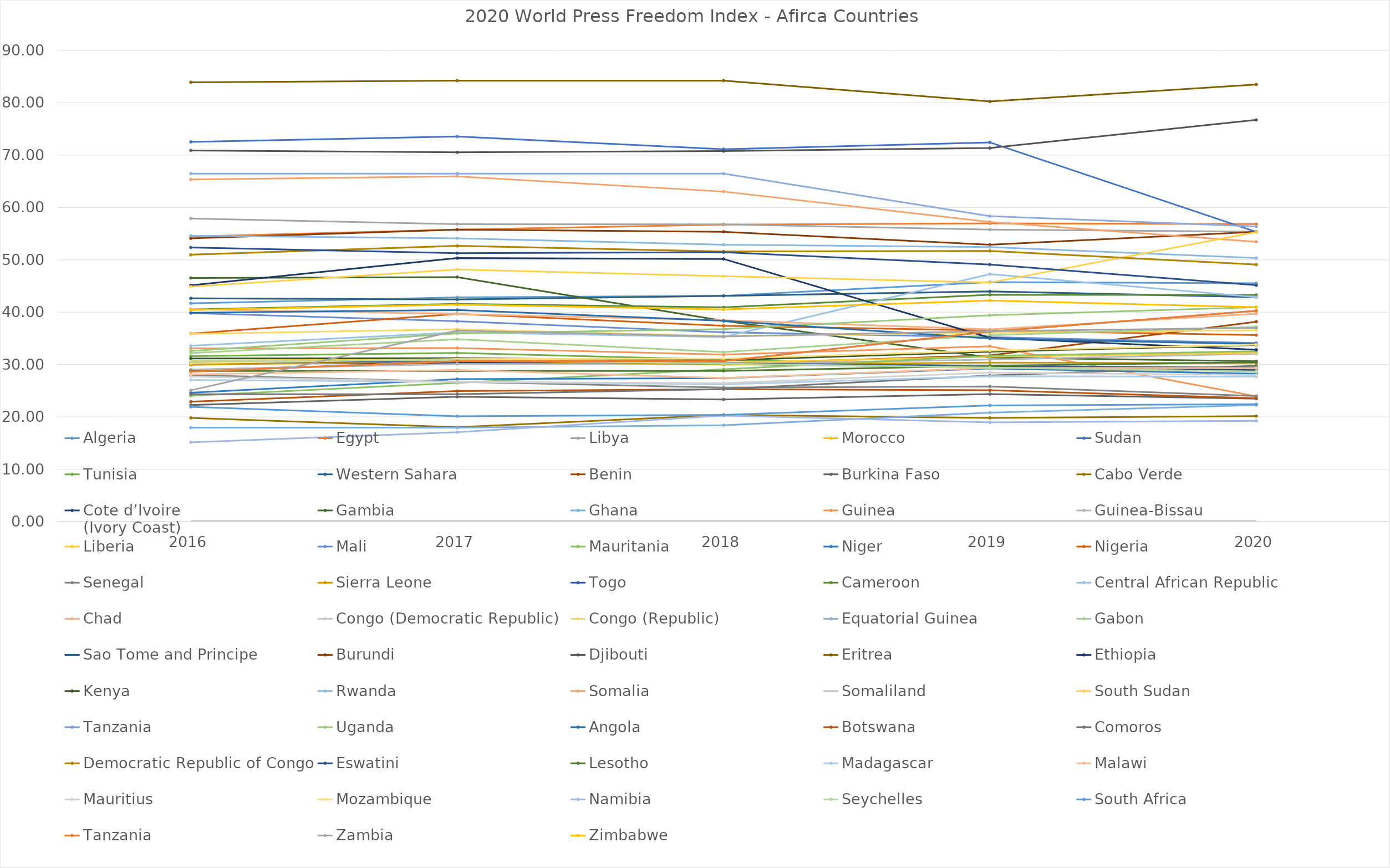
| Category | Algeria | Egypt | Libya | Morocco | Sudan | Tunisia | Western Sahara | Benin | Burkina Faso | Cabo Verde | Cote d’lvoire 
(Ivory Coast) | Gambia | Ghana | Guinea | Guinea-Bissau | Liberia | Mali | Mauritania | Niger | Nigeria | Senegal | Sierra Leone | Togo | Cameroon | Central African Republic | Chad | Congo (Democratic Republic) | Congo (Republic) | Equatorial Guinea | Gabon | Sao Tome and Principe | Burundi | Djibouti | Eritrea | Ethiopia | Kenya | Rwanda | Somalia | Somaliland | South Sudan | Tanzania | Uganda | Angola | Botswana | Comoros | Democratic Republic of Congo | Eswatini | Lesotho | Madagascar | Malawi | Mauritius | Mozambique | Namibia | Seychelles | South Africa | Zambia | Zimbabwe |
|---|---|---|---|---|---|---|---|---|---|---|---|---|---|---|---|---|---|---|---|---|---|---|---|---|---|---|---|---|---|---|---|---|---|---|---|---|---|---|---|---|---|---|---|---|---|---|---|---|---|---|---|---|---|---|---|---|---|
| 2016.0 | 41.69 | 54.45 | 57.89 | 42.64 | 72.53 | 31.6 | 42.64 | 28.97 | 22.26 | 19.81 | 30.17 | 46.53 | 17.95 | 33.08 | 29.03 | 30.71 | 39.83 | 24.03 | 24.63 | 35.9 | 27.99 | 29.94 | 30.31 | 40.53 | 33.6 | 40.59 | 50.97 | 35.84 | 66.47 | 32.2 | 0 | 54.1 | 70.9 | 83.92 | 45.13 | 31.16 | 54.61 | 65.35 | 0 | 44.87 | 28.65 | 32.58 | 39.89 | 22.91 | 24.33 | 50.97 | 52.37 | 28.78 | 27.04 | 28.12 | 27.69 | 30.25 | 15.15 | 30.6 | 21.92 | 25.08 | 40.41 |
| 2017.0 | 42.83 | 55.78 | 56.81 | 42.42 | 73.56 | 32.22 | 42.42 | 30.32 | 23.85 | 18.02 | 30.42 | 46.7 | 17.95 | 33.15 | 30.09 | 31.12 | 38.27 | 26.49 | 27.21 | 39.69 | 26.72 | 30.73 | 30.75 | 41.59 | 36.12 | 39.66 | 52.67 | 36.73 | 66.47 | 34.83 | 0 | 55.78 | 70.54 | 84.24 | 50.34 | 31.2 | 54.11 | 65.95 | 0 | 48.16 | 30.65 | 35.94 | 40.42 | 24.93 | 24.33 | 52.67 | 51.27 | 28.78 | 26.71 | 28.97 | 26.67 | 31.05 | 17.08 | 30.86 | 20.12 | 36.48 | 41.44 |
| 2018.0 | 43.13 | 56.72 | 56.79 | 43.13 | 71.13 | 30.91 | 43.13 | 30.16 | 23.33 | 20.39 | 30.08 | 38.36 | 18.41 | 31.9 | 30.09 | 30.33 | 36.15 | 29.09 | 27.4 | 37.41 | 25.61 | 29.98 | 30.23 | 40.92 | 35.25 | 38.45 | 51.6 | 35.42 | 66.47 | 32.37 | 0 | 55.36 | 70.77 | 84.24 | 50.17 | 30.82 | 52.9 | 63.04 | 0 | 46.88 | 30.65 | 36.77 | 38.35 | 25.29 | 25.3 | 51.6 | 51.46 | 28.78 | 26.2 | 27.43 | 26.45 | 31.12 | 20.24 | 30.17 | 20.39 | 35.36 | 40.53 |
| 2019.0 | 45.75 | 56.97 | 55.77 | 43.98 | 72.43 | 29.61 | 43.98 | 31.74 | 24.35 | 19.81 | 29.52 | 31.35 | 20.81 | 33.49 | 30.95 | 31.49 | 35.23 | 31.65 | 29.26 | 36.5 | 25.81 | 30.36 | 29.69 | 43.32 | 47.27 | 36.71 | 51.71 | 36.04 | 58.35 | 35.6 | 0 | 52.89 | 71.36 | 80.26 | 35.11 | 32.44 | 52.43 | 57.24 | 0 | 45.65 | 36.28 | 39.42 | 34.96 | 25.09 | 27.91 | 51.71 | 49.09 | 29.74 | 27.76 | 29.36 | 28.46 | 32.66 | 18.95 | 29.41 | 22.19 | 36.38 | 42.23 |
| 2020.0 | 45.52 | 56.82 | 55.37 | 42.88 | 55.33 | 29.46 | 42.88 | 38.18 | 23.47 | 20.15 | 28.94 | 30.62 | 22.26 | 23.93 | 32.06 | 32.25 | 34.12 | 32.54 | 28.25 | 35.63 | 23.99 | 30.28 | 29.33 | 43.28 | 42.87 | 39.7 | 49.09 | 36.56 | 56.38 | 37.2 | 0 | 55.35 | 76.73 | 83.5 | 32.82 | 33.72 | 50.34 | 53.45 | 0 | 55.3 | 40.25 | 40.95 | 33.92 | 23.56 | 29.77 | 49.09 | 45.15 | 30.45 | 27.68 | 29.32 | 28 | 33.79 | 19.25 | 28.66 | 22.41 | 37 | 40.95 |